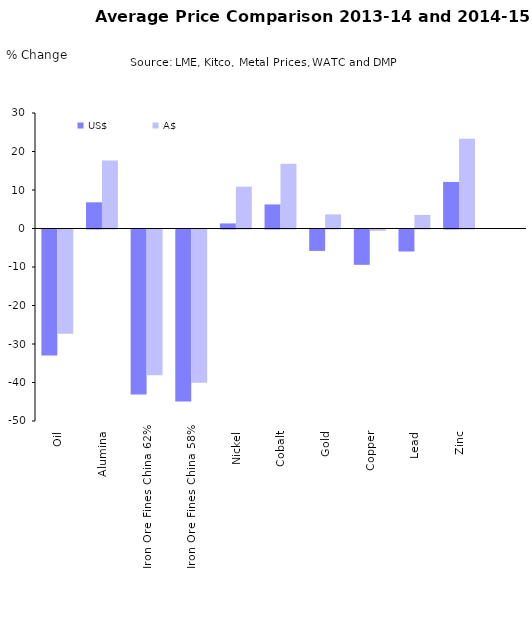
| Category | US$ | A$ |
|---|---|---|
| Oil | -32.698 | -27.084 |
| Alumina | 6.805 | 17.643 |
| Iron Ore Fines China 62% | -42.849 | -37.856 |
| Iron Ore Fines China 58% | -44.688 | -39.828 |
| Nickel | 1.325 | 10.864 |
| Cobalt | 6.252 | 16.841 |
| Gold | -5.561 | 3.676 |
| Copper | -9.176 | -0.345 |
| Lead | -5.712 | 3.527 |
| Zinc | 12.09 | 23.324 |